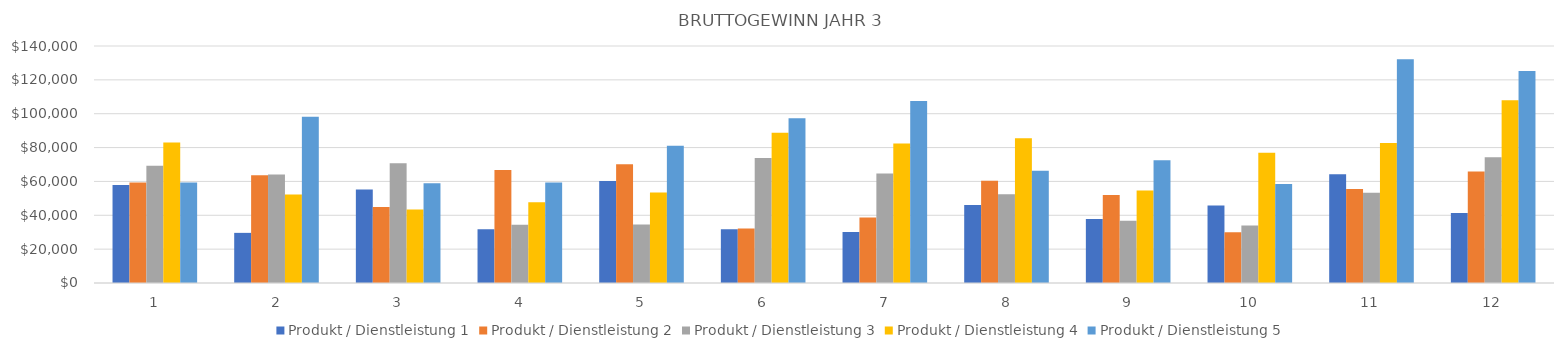
| Category | Produkt / Dienstleistung 1 | Produkt / Dienstleistung 2 | Produkt / Dienstleistung 3 | Produkt / Dienstleistung 4 | Produkt / Dienstleistung 5 |
|---|---|---|---|---|---|
| 0 | 57836.6 | 59440 | 69246 | 82984 | 59413.5 |
| 1 | 29614.1 | 63648 | 64143 | 52347.6 | 98185.5 |
| 2 | 55166.4 | 44895 | 70812 | 43367.7 | 58932.5 |
| 3 | 31708.8 | 66690.6 | 34479 | 47752.2 | 59427.5 |
| 4 | 60206.4 | 70077.2 | 34560 | 53457.6 | 81075 |
| 5 | 31779.6 | 32250.6 | 73809 | 88777.8 | 97290 |
| 6 | 30153.7 | 38663 | 64629 | 82350.9 | 107459.5 |
| 7 | 46071.9 | 60368.4 | 52452 | 85547.7 | 66308.5 |
| 8 | 37793.3 | 52053.6 | 36738 | 54600.9 | 72485.5 |
| 9 | 45727.2 | 29979.2 | 33957 | 76889.7 | 58522 |
| 10 | 64291.5 | 55457.4 | 53364 | 82752.7 | 132151.5 |
| 11 | 41314 | 65830.8 | 74340 | 108009.5 | 125209.5 |